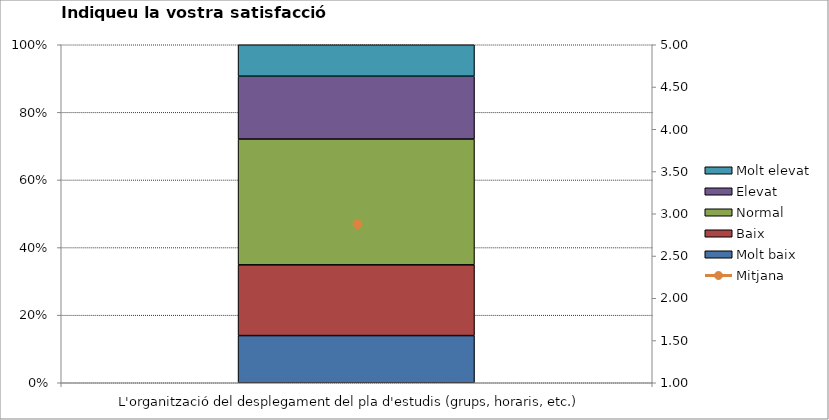
| Category | Molt baix | Baix | Normal  | Elevat | Molt elevat |
|---|---|---|---|---|---|
| L'organització del desplegament del pla d'estudis (grups, horaris, etc.) | 6 | 9 | 16 | 8 | 4 |